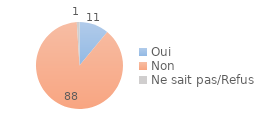
| Category | Series 0 |
|---|---|
| Oui | 11 |
| Non | 88 |
| Ne sait pas/Refus | 1 |